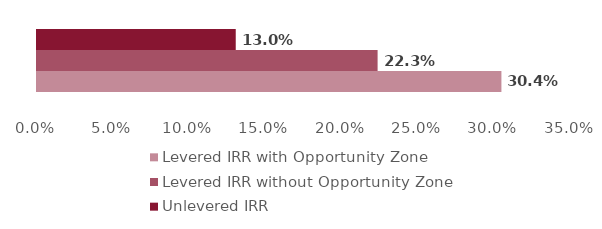
| Category | Levered IRR with Opportunity Zone | Levered IRR without Opportunity Zone | Unlevered IRR |
|---|---|---|---|
| 0 | 0.304 | 0.223 | 0.13 |